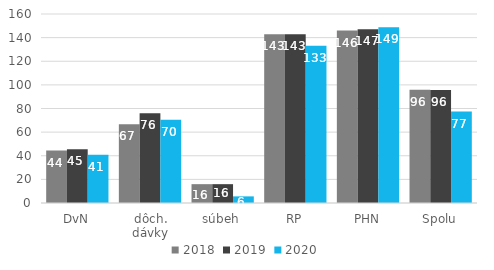
| Category | 2018 | 2019 | 2020 |
|---|---|---|---|
| DvN | 44.379 | 45.446 | 40.808 |
| dôch. dávky | 66.664 | 75.983 | 70.445 |
| súbeh | 15.948 | 15.948 | 5.61 |
| RP | 142.918 | 142.918 | 133.093 |
| PHN | 145.975 | 147.022 | 148.756 |
| Spolu | 95.815 | 95.559 | 77.358 |